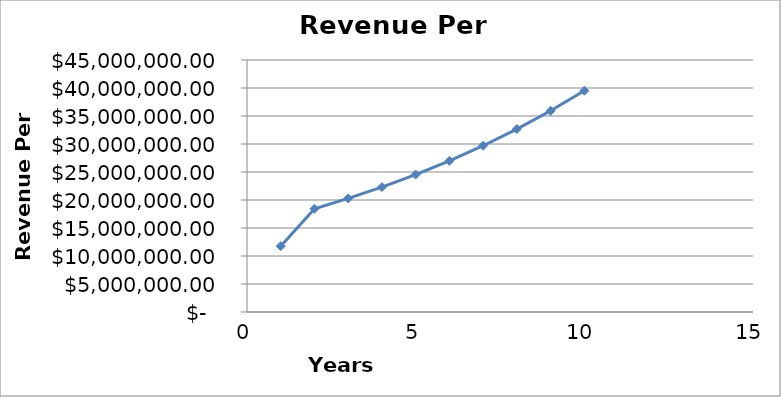
| Category | Series 0 |
|---|---|
| 1.0 | 11760564.66 |
| 2.0 | 18436621.126 |
| 3.0 | 20280283.239 |
| 4.0 | 22308311.562 |
| 5.0 | 24539142.719 |
| 6.0 | 26993056.991 |
| 7.0 | 29692362.69 |
| 8.0 | 32661598.959 |
| 9.0 | 35927758.854 |
| 10.0 | 39520534.74 |